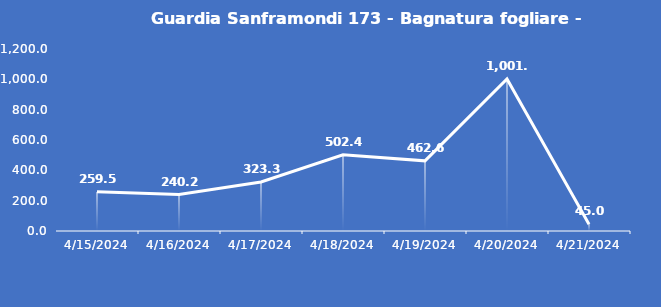
| Category | Guardia Sanframondi 173 - Bagnatura fogliare - Grezzo (min) |
|---|---|
| 4/15/24 | 259.5 |
| 4/16/24 | 240.2 |
| 4/17/24 | 323.3 |
| 4/18/24 | 502.4 |
| 4/19/24 | 462.6 |
| 4/20/24 | 1001.9 |
| 4/21/24 | 45 |